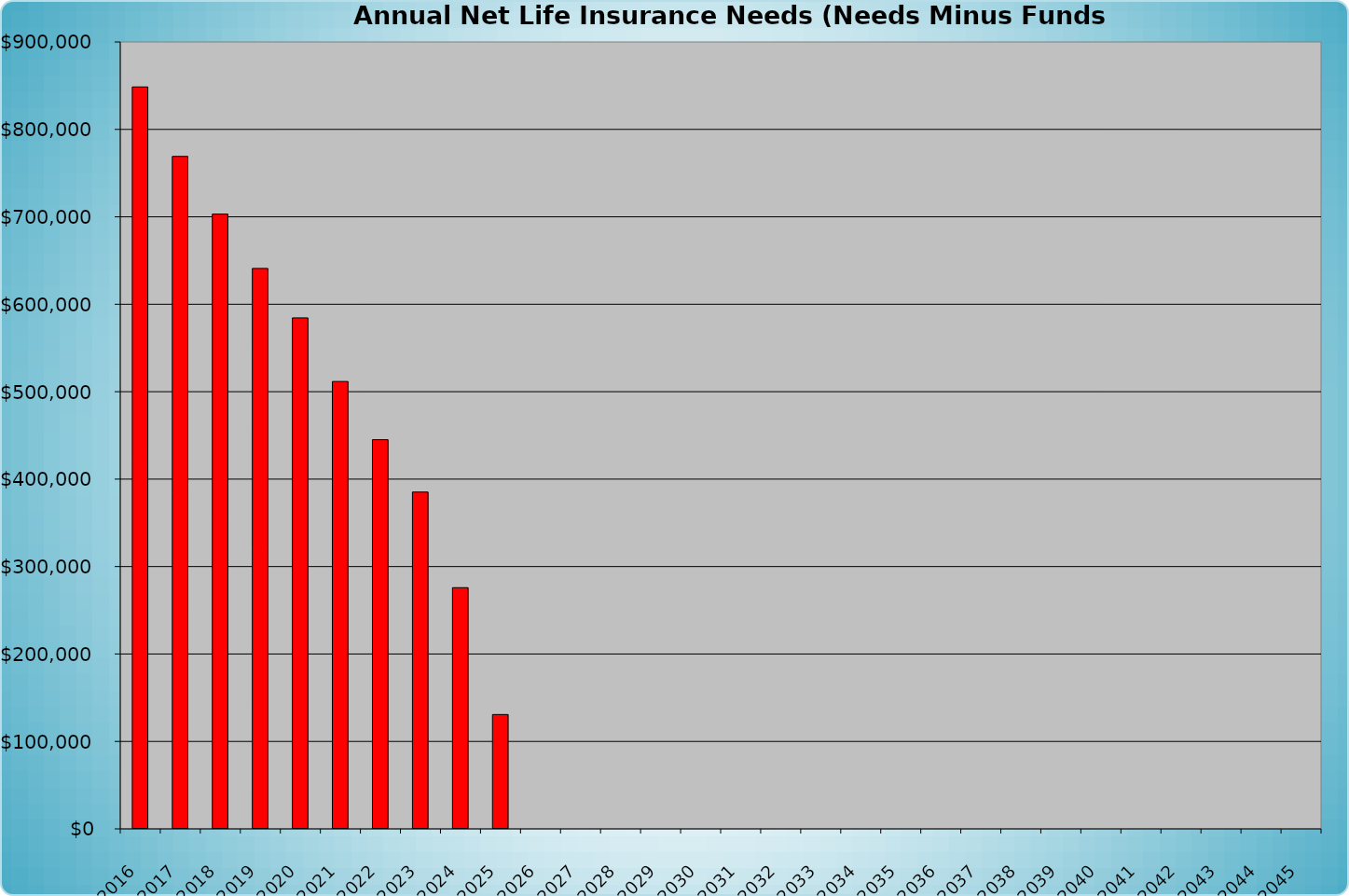
| Category | Total Net Amount of Life Insurance Needed |
|---|---|
| 2016.0 | 848566.574 |
| 2017.0 | 769121.275 |
| 2018.0 | 703121.983 |
| 2019.0 | 640993.983 |
| 2020.0 | 584429.72 |
| 2021.0 | 511676.75 |
| 2022.0 | 445113.117 |
| 2023.0 | 385221.263 |
| 2024.0 | 275868.662 |
| 2025.0 | 130779.926 |
| 2026.0 | 0 |
| 2027.0 | 0 |
| 2028.0 | 0 |
| 2029.0 | 0 |
| 2030.0 | 0 |
| 2031.0 | 0 |
| 2032.0 | 0 |
| 2033.0 | 0 |
| 2034.0 | 0 |
| 2035.0 | 0 |
| 2036.0 | 0 |
| 2037.0 | 0 |
| 2038.0 | 0 |
| 2039.0 | 0 |
| 2040.0 | 0 |
| 2041.0 | 0 |
| 2042.0 | 0 |
| 2043.0 | 0 |
| 2044.0 | 0 |
| 2045.0 | 0 |